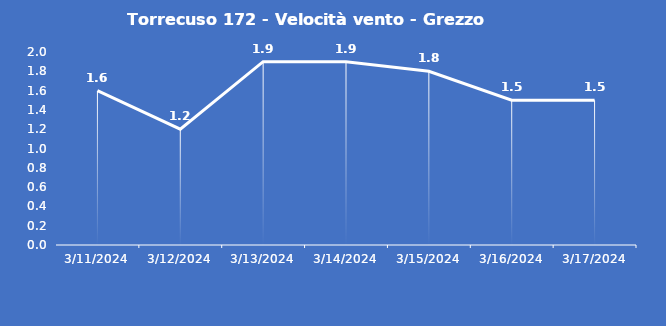
| Category | Torrecuso 172 - Velocità vento - Grezzo (m/s) |
|---|---|
| 3/11/24 | 1.6 |
| 3/12/24 | 1.2 |
| 3/13/24 | 1.9 |
| 3/14/24 | 1.9 |
| 3/15/24 | 1.8 |
| 3/16/24 | 1.5 |
| 3/17/24 | 1.5 |